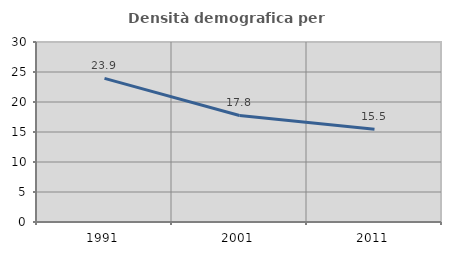
| Category | Densità demografica |
|---|---|
| 1991.0 | 23.932 |
| 2001.0 | 17.752 |
| 2011.0 | 15.451 |